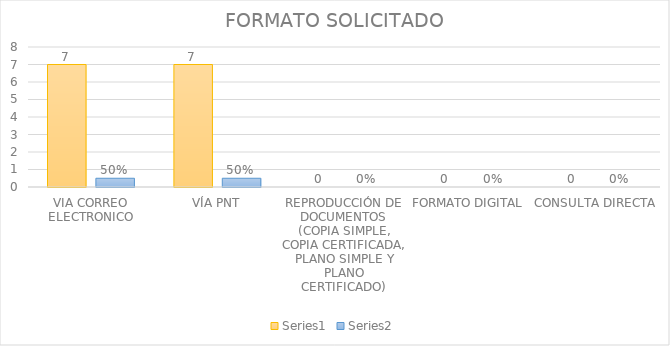
| Category | Series 3 | Series 4 |
|---|---|---|
| VIA CORREO ELECTRONICO | 7 | 0.5 |
| VÍA PNT | 7 | 0.5 |
| REPRODUCCIÓN DE DOCUMENTOS (COPIA SIMPLE, COPIA CERTIFICADA, PLANO SIMPLE Y PLANO CERTIFICADO) | 0 | 0 |
| FORMATO DIGITAL | 0 | 0 |
| CONSULTA DIRECTA | 0 | 0 |